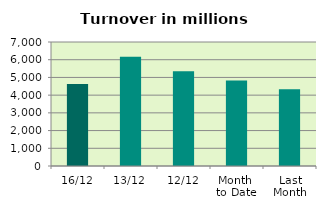
| Category | Series 0 |
|---|---|
| 16/12 | 4629.76 |
| 13/12 | 6164.627 |
| 12/12 | 5344.314 |
| Month 
to Date | 4823.03 |
| Last
Month | 4332.538 |